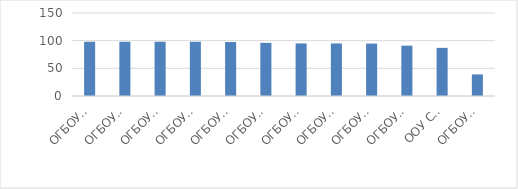
| Category | Series 0 |
|---|---|
| ОГБОУ СПО Ульяновский техникум железнодорожного транспорта | 98 |
| ОГБОУ СПО «Димитровградский техникум строительной индустрии» | 98 |
| ОГБОУ СПО «Димитровградский техникум профессиональных технологий имени Героя Советского Союза М.С.Чернова» | 98 |
| ОГБОУ СПО «Димитровградский механико-технологический колледж молочной промышленности» | 98 |
| ОГБОУ СПО профессионального образования " Сурский агротехнологический техникум "  | 97.5 |
| ОГБОУ СПО Ульяновский социально-педагогический колледж №1 | 96 |
| ОГБОУ СПО технологический техникум в р.п. Николаевка  | 95 |
| ОГБОУ СПО технологический техникум р.п.Павловка | 95 |
| ОГБОУ СПО "Ульяновский строительный колледж" | 94.75 |
| ОГБОУ СПО «Карсунский медицинский техникум» | 91 |
| ООУ СПО«Ульяновский электромеханический колледж» | 87 |
| ОГБОУ СПО технологический техникум в р.п.Радищево | 39 |